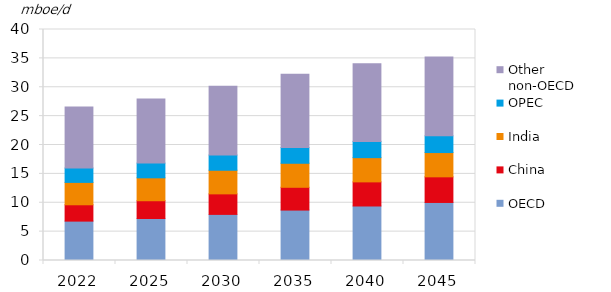
| Category | OECD | China | India | OPEC | Other non-OECD |
|---|---|---|---|---|---|
| 2022.0 | 6.819 | 2.83 | 3.874 | 2.486 | 10.579 |
| 2025.0 | 7.271 | 3.077 | 3.969 | 2.546 | 11.083 |
| 2030.0 | 7.985 | 3.553 | 4.089 | 2.637 | 11.894 |
| 2035.0 | 8.732 | 3.945 | 4.16 | 2.732 | 12.695 |
| 2040.0 | 9.438 | 4.176 | 4.197 | 2.816 | 13.455 |
| 2045.0 | 10.05 | 4.438 | 4.204 | 2.89 | 13.656 |